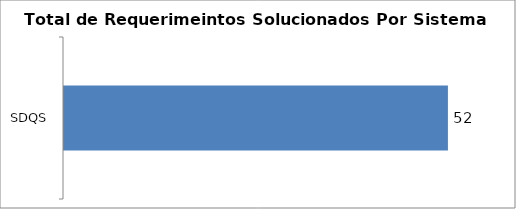
| Category | Total |
|---|---|
| SDQS | 52 |